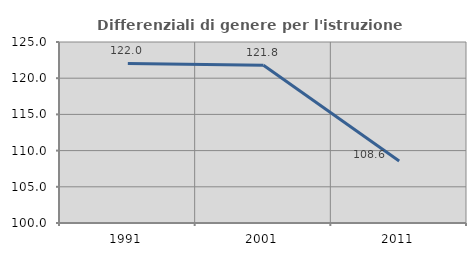
| Category | Differenziali di genere per l'istruzione superiore |
|---|---|
| 1991.0 | 122.031 |
| 2001.0 | 121.788 |
| 2011.0 | 108.556 |